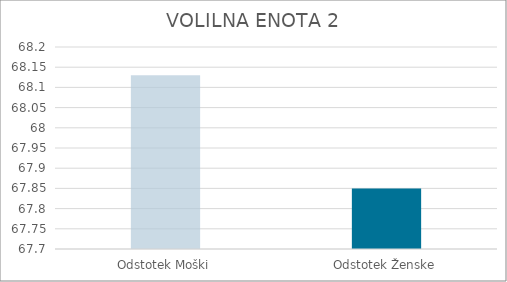
| Category | Series 0 |
|---|---|
| Odstotek Moški | 68.13 |
| Odstotek Ženske | 67.85 |